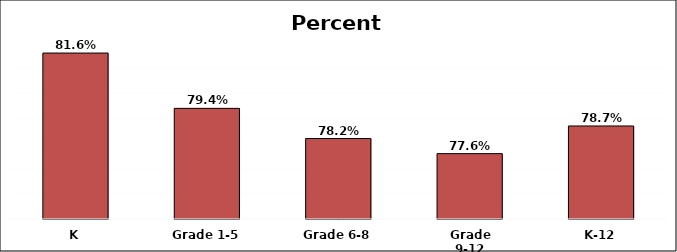
| Category | Series 0 |
|---|---|
| K | 0.816 |
| Grade 1-5 | 0.794 |
| Grade 6-8 | 0.782 |
| Grade 9-12 | 0.776 |
| K-12 | 0.787 |